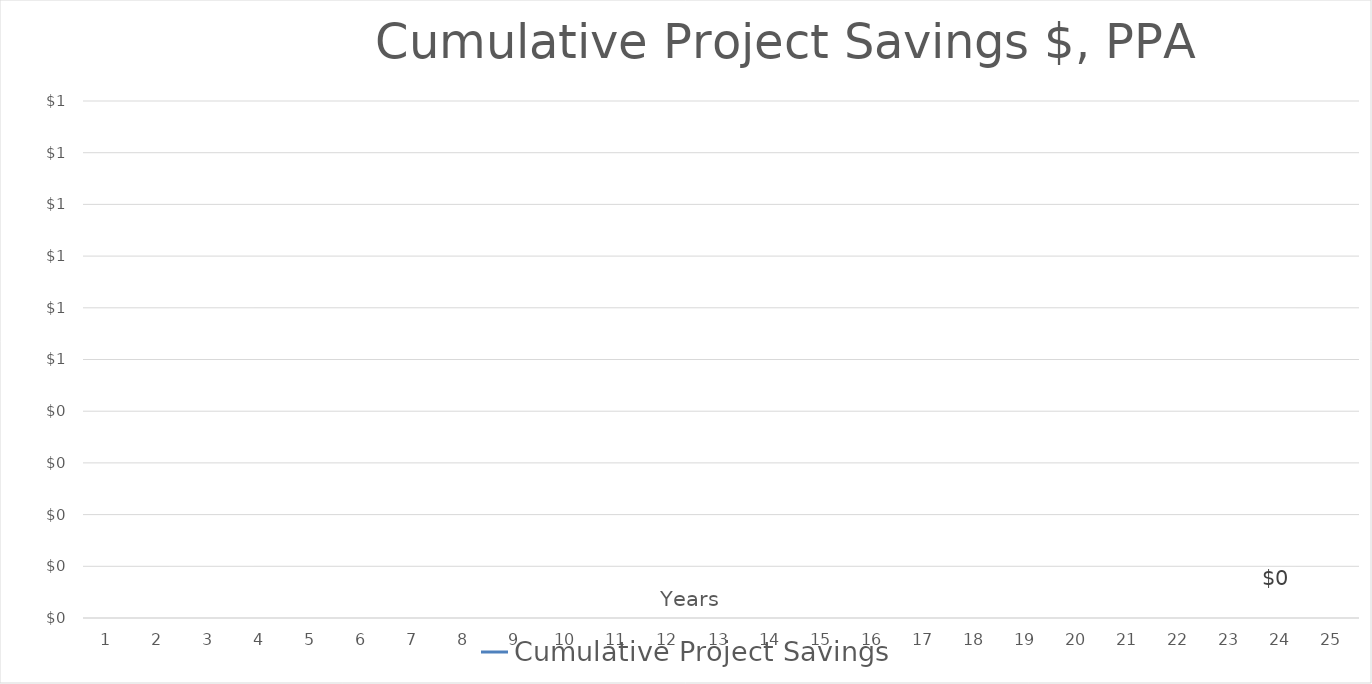
| Category | Cumulative Project Savings |
|---|---|
| 1.0 | 0 |
| 2.0 | 0 |
| 3.0 | 0 |
| 4.0 | 0 |
| 5.0 | 0 |
| 6.0 | 0 |
| 7.0 | 0 |
| 8.0 | 0 |
| 9.0 | 0 |
| 10.0 | 0 |
| 11.0 | 0 |
| 12.0 | 0 |
| 13.0 | 0 |
| 14.0 | 0 |
| 15.0 | 0 |
| 16.0 | 0 |
| 17.0 | 0 |
| 18.0 | 0 |
| 19.0 | 0 |
| 20.0 | 0 |
| 21.0 | 0 |
| 22.0 | 0 |
| 23.0 | 0 |
| 24.0 | 0 |
| 25.0 | 0 |